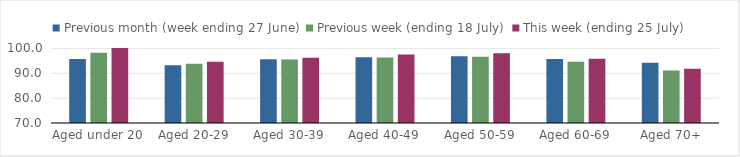
| Category | Previous month (week ending 27 June) | Previous week (ending 18 July) | This week (ending 25 July) |
|---|---|---|---|
| Aged under 20 | 95.78 | 98.22 | 100.132 |
| Aged 20-29 | 93.236 | 93.87 | 94.623 |
| Aged 30-39 | 95.641 | 95.514 | 96.262 |
| Aged 40-49 | 96.473 | 96.371 | 97.534 |
| Aged 50-59 | 96.838 | 96.645 | 98.022 |
| Aged 60-69 | 95.754 | 94.676 | 95.823 |
| Aged 70+ | 94.273 | 91.077 | 91.871 |